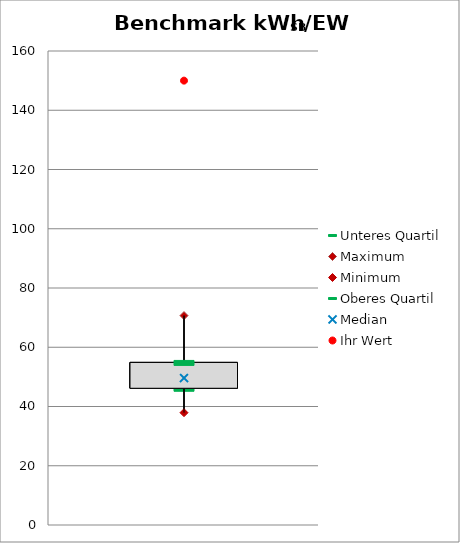
| Category | Unteres Quartil | Maximum | Minimum | Oberes Quartil |
|---|---|---|---|---|
| kWhSB/EW | 46.152 | 70.688 | 37.91 | 54.878 |